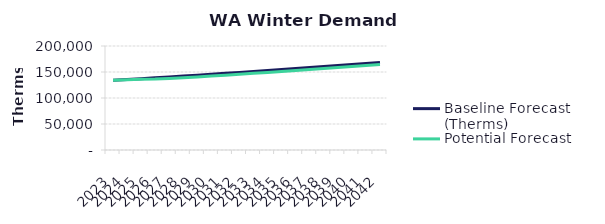
| Category | Baseline Forecast (Therms) | Potential Forecast |
|---|---|---|
| 2023.0 | 133994.605 | 133994.605 |
| 2024.0 | 135530.448 | 135089.856 |
| 2025.0 | 137210.239 | 136080.717 |
| 2026.0 | 138895.626 | 136489.036 |
| 2027.0 | 140570.124 | 137520.199 |
| 2028.0 | 142265.44 | 138863.575 |
| 2029.0 | 143981.839 | 140532.204 |
| 2030.0 | 145719.591 | 142221.44 |
| 2031.0 | 147478.968 | 143937.586 |
| 2032.0 | 149260.246 | 145675.085 |
| 2033.0 | 151063.706 | 147434.211 |
| 2034.0 | 152889.63 | 149215.239 |
| 2035.0 | 154738.305 | 151018.449 |
| 2036.0 | 156610.023 | 152844.125 |
| 2037.0 | 158505.078 | 154692.554 |
| 2038.0 | 160423.769 | 156564.026 |
| 2039.0 | 162366.398 | 158458.838 |
| 2040.0 | 164333.272 | 160377.287 |
| 2041.0 | 166324.701 | 162319.675 |
| 2042.0 | 168340.999 | 164286.31 |